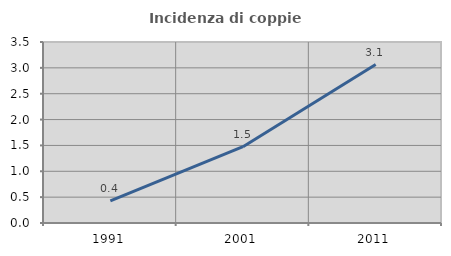
| Category | Incidenza di coppie miste |
|---|---|
| 1991.0 | 0.43 |
| 2001.0 | 1.476 |
| 2011.0 | 3.063 |